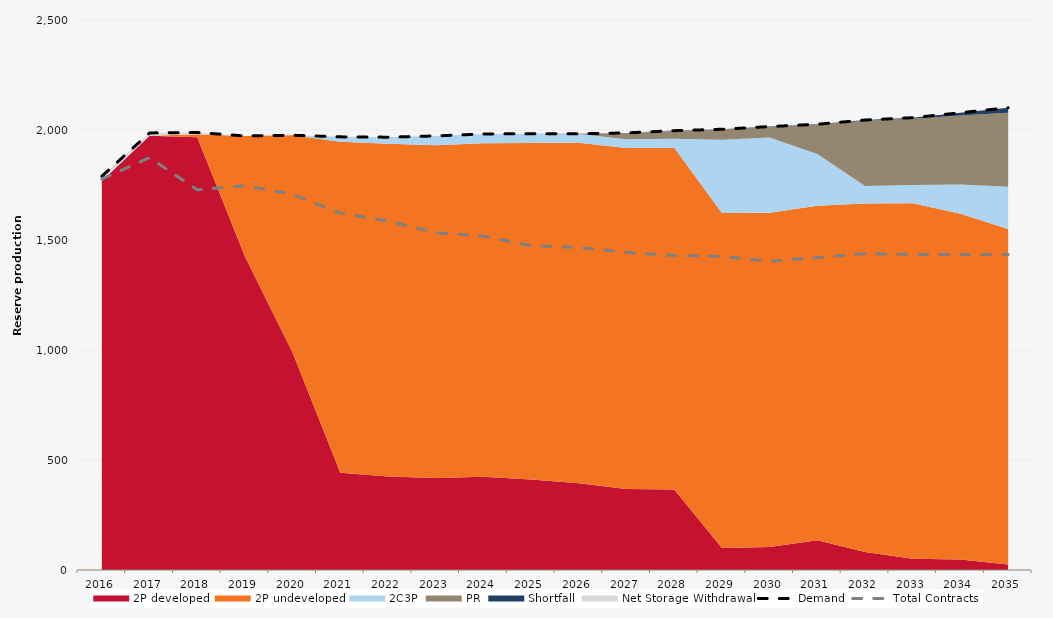
| Category | Demand | Total Contracts |
|---|---|---|
| 0 | 1789.978 | 1776.781 |
| 1 | 1986.734 | 1874.371 |
| 2 | 1988.584 | 1727.997 |
| 3 | 1972.907 | 1746.967 |
| 4 | 1976.138 | 1707.643 |
| 5 | 1968.803 | 1621.977 |
| 6 | 1967.428 | 1586.126 |
| 7 | 1973.056 | 1533.126 |
| 8 | 1981.998 | 1517.777 |
| 9 | 1983.101 | 1474.136 |
| 10 | 1982.628 | 1466.013 |
| 11 | 1986.784 | 1443.817 |
| 12 | 1996.956 | 1429.645 |
| 13 | 2003.382 | 1425.788 |
| 14 | 2015.563 | 1403.548 |
| 15 | 2026.093 | 1420.349 |
| 16 | 2045.329 | 1438.314 |
| 17 | 2055.963 | 1434.467 |
| 18 | 2078.443 | 1434.453 |
| 19 | 2101.306 | 1434.032 |